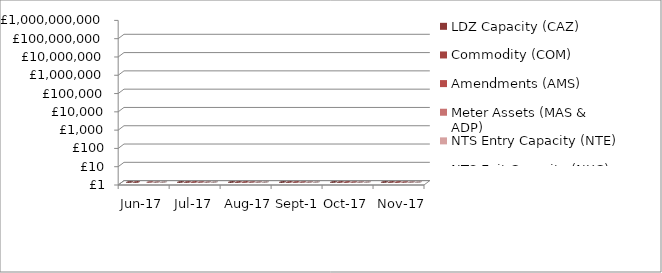
| Category | LDZ Capacity (CAZ) | Commodity (COM) | Amendments (AMS) | Meter Assets (MAS & ADP) | NTS Entry Capacity (NTE) | NTS Exit Capacity (NXC) |
|---|---|---|---|---|---|---|
| 2017-06-01 | 288773735.37 | 16487569.55 | -3258688.63 | 187370.3 | 2007422.43 | 22701563.13 |
| 2017-07-01 | 298593731.84 | 16897919.7 | 247176.37 | 193814.49 | 1970532.91 | 23462413.06 |
| 2017-08-01 | 298862406.46 | 16761360.58 | 1357290.74 | 193840.59 | 1969937.93 | 23465025.38 |
| 2017-09-01 | 289415948.74 | 20098400.73 | 205300.25 | 187587.95 | 1855267.92 | 22811559.53 |
| 2017-10-01 | 299201864.14 | 26855499.51 | 321543.98 | 193840.32 | 11176717.5 | 18097117.82 |
| 2017-11-01 | 290194555.87 | 41901625.24 | 281193.04 | 187587.95 | 12089719.21 | 18734838.83 |